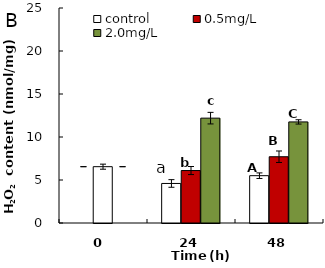
| Category | control | 0.5mg/L | 2.0mg/L |
|---|---|---|---|
| 0.0 | 6.549 | 6.549 | 6.549 |
| 24.0 | 4.598 | 6.1 | 12.192 |
| 48.0 | 5.502 | 7.705 | 11.755 |